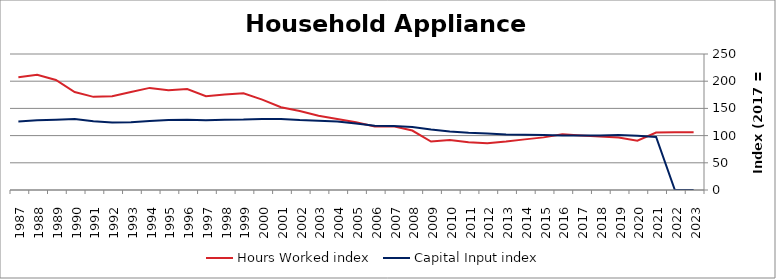
| Category | Hours Worked index | Capital Input index |
|---|---|---|
| 2023.0 | 106.033 | 0 |
| 2022.0 | 106.168 | 0 |
| 2021.0 | 105.479 | 97.467 |
| 2020.0 | 90.727 | 99.556 |
| 2019.0 | 96.619 | 100.942 |
| 2018.0 | 98.284 | 100.116 |
| 2017.0 | 100 | 100 |
| 2016.0 | 102.369 | 100.331 |
| 2015.0 | 96.732 | 101.168 |
| 2014.0 | 93.056 | 101.503 |
| 2013.0 | 88.971 | 101.992 |
| 2012.0 | 86.111 | 103.939 |
| 2011.0 | 87.688 | 105.381 |
| 2010.0 | 91.708 | 107.624 |
| 2009.0 | 89.175 | 111.256 |
| 2008.0 | 109.314 | 115.78 |
| 2007.0 | 117.193 | 117.837 |
| 2006.0 | 116.662 | 118.326 |
| 2005.0 | 124.506 | 122.149 |
| 2004.0 | 130.528 | 125.738 |
| 2003.0 | 136.332 | 127.42 |
| 2002.0 | 145.357 | 128.474 |
| 2001.0 | 152.105 | 130.626 |
| 2000.0 | 166.033 | 130.67 |
| 1999.0 | 177.868 | 129.396 |
| 1998.0 | 175.711 | 129.227 |
| 1997.0 | 172.445 | 128.191 |
| 1996.0 | 185.593 | 129.209 |
| 1995.0 | 183.386 | 128.515 |
| 1994.0 | 187.703 | 127.048 |
| 1993.0 | 180.111 | 124.715 |
| 1992.0 | 172.22 | 124.11 |
| 1991.0 | 171.214 | 126.457 |
| 1990.0 | 180.125 | 130.502 |
| 1989.0 | 202.208 | 128.965 |
| 1988.0 | 211.931 | 128.021 |
| 1987.0 | 207.365 | 125.988 |